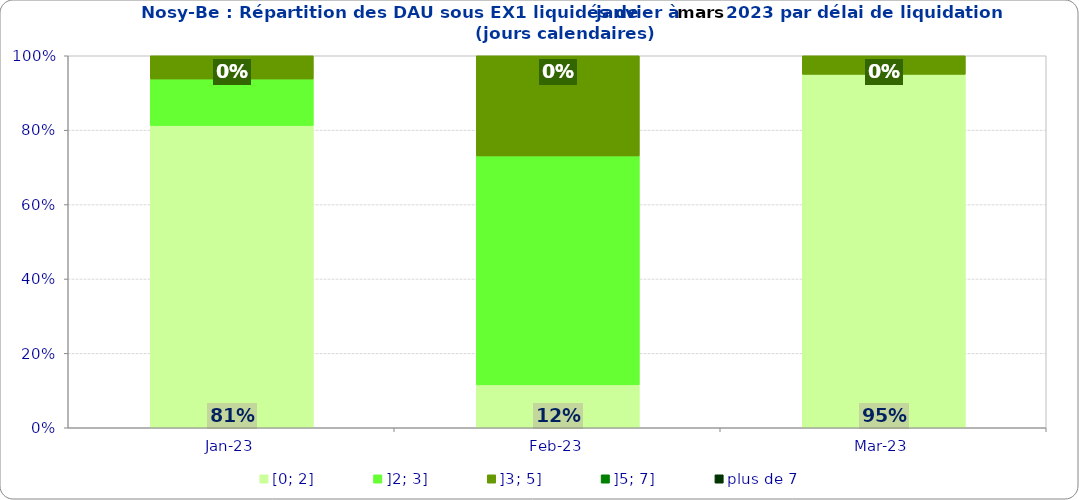
| Category | [0; 2] | ]2; 3] | ]3; 5] | ]5; 7] | plus de 7 |
|---|---|---|---|---|---|
| 2023-01-01 | 0.812 | 0.125 | 0.062 | 0 | 0 |
| 2023-02-01 | 0.115 | 0.615 | 0.269 | 0 | 0 |
| 2023-03-01 | 0.95 | 0 | 0.05 | 0 | 0 |